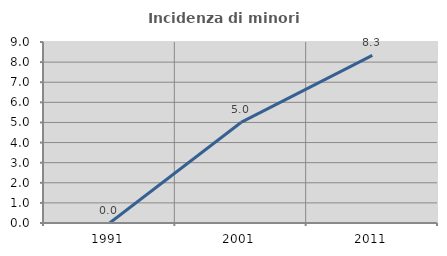
| Category | Incidenza di minori stranieri |
|---|---|
| 1991.0 | 0 |
| 2001.0 | 5 |
| 2011.0 | 8.333 |